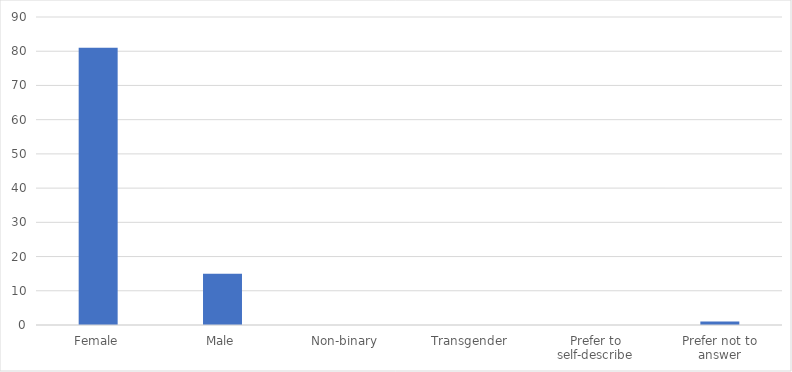
| Category | Number of Responses |
|---|---|
| Female | 81 |
| Male | 15 |
| Non-binary | 0 |
| Transgender | 0 |
| Prefer to self-describe | 0 |
| Prefer not to answer | 1 |